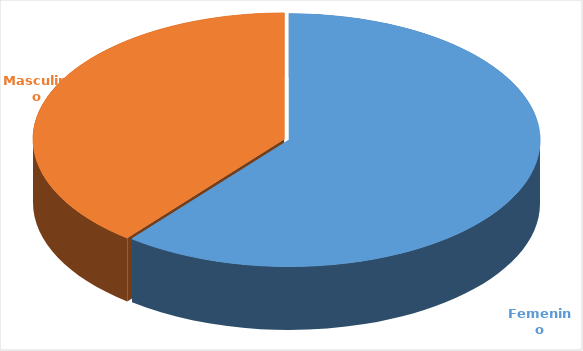
| Category | Cantidad  |
|---|---|
| Femenino | 3462 |
| Masculino | 2238 |